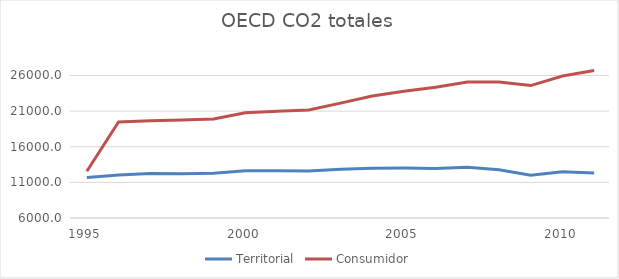
| Category | Territorial | Consumidor |
|---|---|---|
| 1995.0 | 11667.744 | 12554.974 |
| 1996.0 | 12050.747 | 19470.29 |
| 1997.0 | 12228.538 | 19638.378 |
| 1998.0 | 12202.221 | 19755.795 |
| 1999.0 | 12280.135 | 19896.045 |
| 2000.0 | 12618.342 | 20758.575 |
| 2001.0 | 12647.563 | 20967.217 |
| 2002.0 | 12610.985 | 21146.523 |
| 2003.0 | 12845.488 | 22127.577 |
| 2004.0 | 12983.44 | 23120.441 |
| 2005.0 | 13011.003 | 23776.763 |
| 2006.0 | 12954.545 | 24356.03 |
| 2007.0 | 13116.237 | 25098.985 |
| 2008.0 | 12772.379 | 25071.947 |
| 2009.0 | 11997.988 | 24584.157 |
| 2010.0 | 12496.334 | 25918.886 |
| 2011.0 | 12329.731 | 26701.258 |